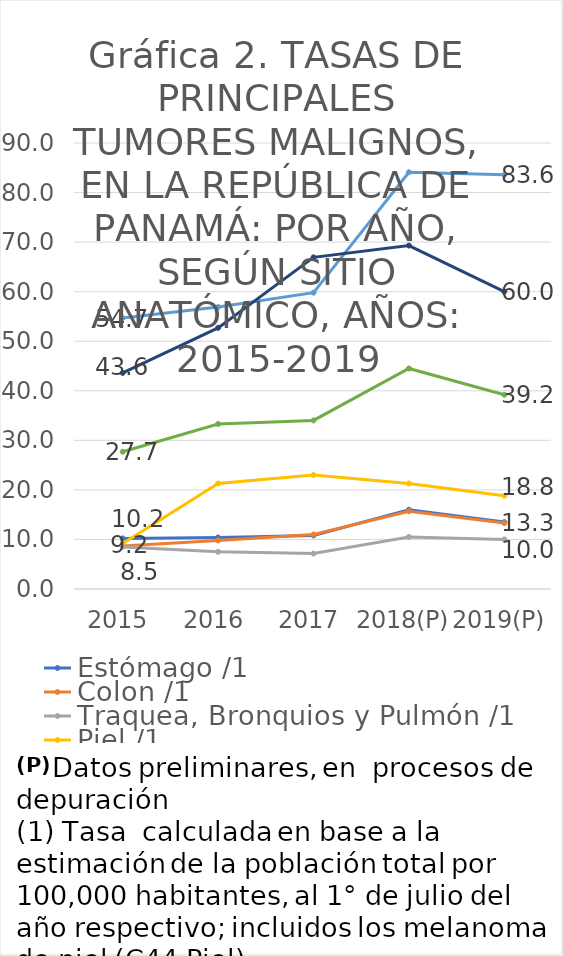
| Category | Estómago /1 | Colon /1 | Traquea, Bronquios y Pulmón /1 | Piel /1 | Mama Femenina /2 | Cuello del Utero /2 | Próstata  /2 |
|---|---|---|---|---|---|---|---|
| 2015 | 10.2 | 8.7 | 8.5 | 9.2 | 54.7 | 27.7 | 43.6 |
| 2016 | 10.4 | 9.8 | 7.5 | 21.3 | 56.9 | 33.3 | 52.7 |
| 2017 | 10.8 | 11 | 7.15 | 23 | 59.8 | 34.02 | 66.92 |
| 2018(P) | 16 | 15.7 | 10.5 | 21.3 | 84.1 | 44.5 | 69.3 |
| 2019(P) | 13.5 | 13.3 | 10 | 18.8 | 83.6 | 39.2 | 60 |